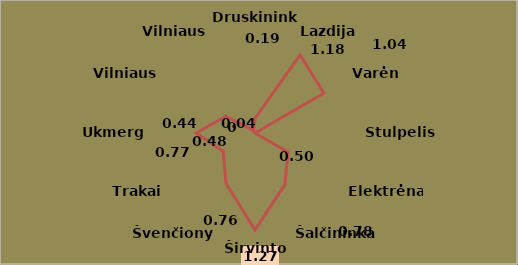
| Category | 1.21 |
|---|---|
| Druskininkai | 0.19 |
| Lazdijai | 1.18 |
| Varėna | 1.04 |
| Stulpelis1 | 0 |
| Elektrėnai | 0.5 |
| Šalčininkai | 0.78 |
| Širvintos | 1.27 |
| Švenčionys | 0.76 |
| Trakai | 0.48 |
| Ukmergė | 0.77 |
| Vilniaus r. | 0.44 |
| Vilniaus m. | 0.04 |